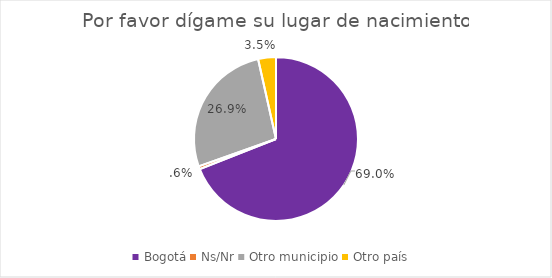
| Category | Series 0 |
|---|---|
| Bogotá | 0.69 |
| Ns/Nr | 0.006 |
| Otro municipio | 0.269 |
| Otro país | 0.035 |